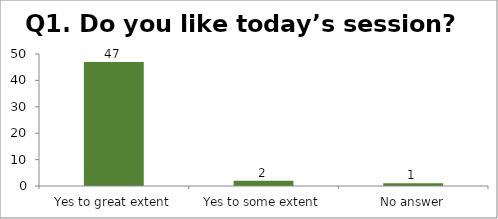
| Category | Q1. Do you like today’s session? |
|---|---|
| Yes to great extent | 47 |
| Yes to some extent | 2 |
| No answer | 1 |